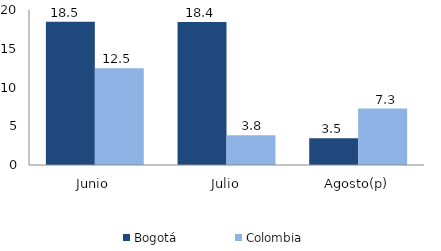
| Category | Bogotá | Colombia |
|---|---|---|
| Junio | 18.493 | 12.473 |
| Julio | 18.442 | 3.847 |
| Agosto(p) | 3.452 | 7.278 |